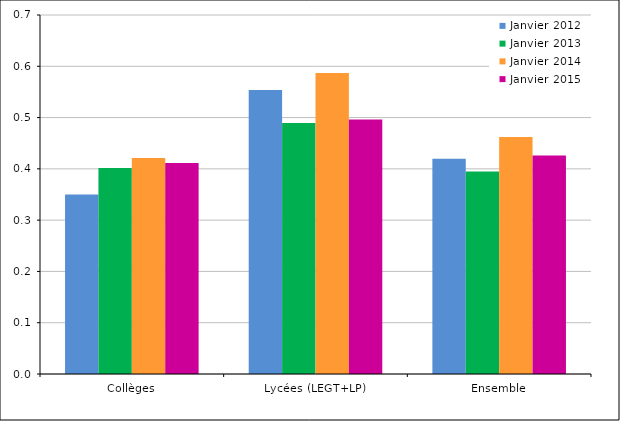
| Category | Janvier 2012 | Janvier 2013 | Janvier 2014 | Janvier 2015 |
|---|---|---|---|---|
| Collèges | 0.35 | 0.401 | 0.421 | 0.411 |
| Lycées (LEGT+LP) | 0.554 | 0.489 | 0.587 | 0.496 |
| Ensemble | 0.42 | 0.395 | 0.462 | 0.426 |